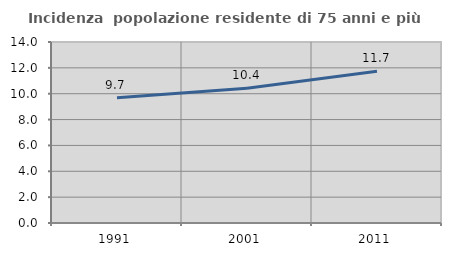
| Category | Incidenza  popolazione residente di 75 anni e più |
|---|---|
| 1991.0 | 9.693 |
| 2001.0 | 10.426 |
| 2011.0 | 11.734 |